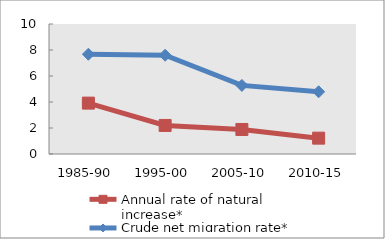
| Category | Annual rate of natural increase* | Crude net migration rate* |
|---|---|---|
| 1985-90 | 3.914 | 7.674 |
| 1995-00 | 2.195 | 7.597 |
| 2005-10 | 1.887 | 5.277 |
| 2010-15 | 1.219 | 4.788 |